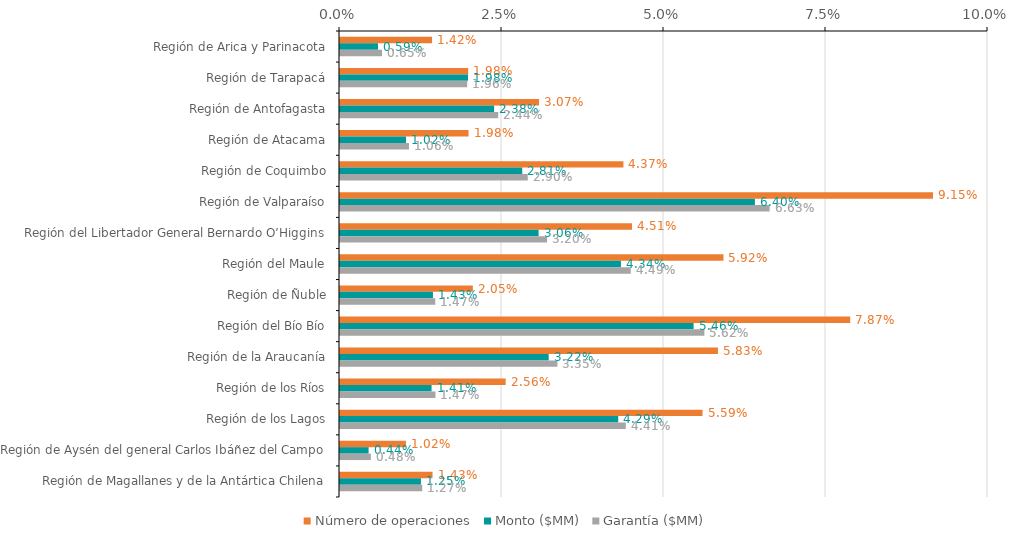
| Category | Número de operaciones | Monto ($MM) | Garantía ($MM) |
|---|---|---|---|
| Región de Arica y Parinacota | 0.014 | 0.006 | 0.006 |
| Región de Tarapacá | 0.02 | 0.02 | 0.02 |
| Región de Antofagasta | 0.031 | 0.024 | 0.024 |
| Región de Atacama | 0.02 | 0.01 | 0.011 |
| Región de Coquimbo | 0.044 | 0.028 | 0.029 |
| Región de Valparaíso | 0.092 | 0.064 | 0.066 |
| Región del Libertador General Bernardo O’Higgins | 0.045 | 0.031 | 0.032 |
| Región del Maule | 0.059 | 0.043 | 0.045 |
| Región de Ñuble | 0.02 | 0.014 | 0.015 |
| Región del Bío Bío | 0.079 | 0.055 | 0.056 |
| Región de la Araucanía | 0.058 | 0.032 | 0.034 |
| Región de los Ríos | 0.026 | 0.014 | 0.015 |
| Región de los Lagos | 0.056 | 0.043 | 0.044 |
| Región de Aysén del general Carlos Ibáñez del Campo | 0.01 | 0.004 | 0.005 |
| Región de Magallanes y de la Antártica Chilena | 0.014 | 0.012 | 0.013 |